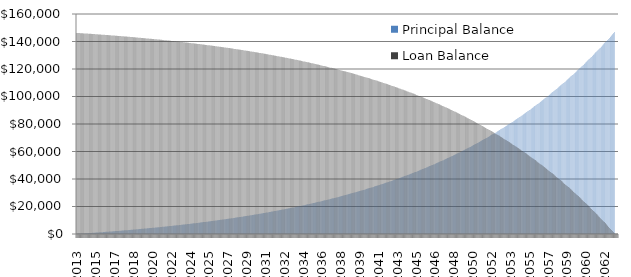
| Category | Principal Balance  | Loan Balance  |
|---|---|---|
| 2013.0 | 42.205 | 146250 |
| 2013.0 | 84.613 | 146207.795 |
| 2013.0 | 127.223 | 146165.387 |
| 2013.0 | 170.038 | 146122.777 |
| 2014.0 | 213.058 | 146079.962 |
| 2014.0 | 256.284 | 146036.942 |
| 2014.0 | 299.718 | 145993.716 |
| 2014.0 | 343.359 | 145950.282 |
| 2014.0 | 387.209 | 145906.641 |
| 2014.0 | 431.27 | 145862.791 |
| 2014.0 | 475.542 | 145818.73 |
| 2014.0 | 520.026 | 145774.458 |
| 2014.0 | 564.723 | 145729.974 |
| 2014.0 | 609.634 | 145685.277 |
| 2014.0 | 654.76 | 145640.366 |
| 2014.0 | 700.103 | 145595.24 |
| 2015.0 | 745.663 | 145549.897 |
| 2015.0 | 791.441 | 145504.337 |
| 2015.0 | 837.438 | 145458.559 |
| 2015.0 | 883.656 | 145412.562 |
| 2015.0 | 930.096 | 145366.344 |
| 2015.0 | 976.758 | 145319.904 |
| 2015.0 | 1023.643 | 145273.242 |
| 2015.0 | 1070.753 | 145226.357 |
| 2015.0 | 1118.089 | 145179.247 |
| 2015.0 | 1165.652 | 145131.911 |
| 2015.0 | 1213.443 | 145084.348 |
| 2015.0 | 1261.462 | 145036.557 |
| 2016.0 | 1309.712 | 144988.538 |
| 2016.0 | 1358.193 | 144940.288 |
| 2016.0 | 1406.906 | 144891.807 |
| 2016.0 | 1455.853 | 144843.094 |
| 2016.0 | 1505.034 | 144794.147 |
| 2016.0 | 1554.451 | 144744.966 |
| 2016.0 | 1604.104 | 144695.549 |
| 2016.0 | 1653.996 | 144645.896 |
| 2016.0 | 1704.127 | 144596.004 |
| 2016.0 | 1754.497 | 144545.873 |
| 2016.0 | 1805.11 | 144495.503 |
| 2016.0 | 1855.964 | 144444.89 |
| 2017.0 | 1907.063 | 144394.036 |
| 2017.0 | 1958.406 | 144342.937 |
| 2017.0 | 2009.995 | 144291.594 |
| 2017.0 | 2061.832 | 144240.005 |
| 2017.0 | 2113.916 | 144188.168 |
| 2017.0 | 2166.251 | 144136.084 |
| 2017.0 | 2218.836 | 144083.749 |
| 2017.0 | 2271.673 | 144031.164 |
| 2017.0 | 2324.764 | 143978.327 |
| 2017.0 | 2378.108 | 143925.236 |
| 2017.0 | 2431.709 | 143871.892 |
| 2017.0 | 2485.566 | 143818.291 |
| 2018.0 | 2539.681 | 143764.434 |
| 2018.0 | 2594.055 | 143710.319 |
| 2018.0 | 2648.691 | 143655.945 |
| 2018.0 | 2703.587 | 143601.309 |
| 2018.0 | 2758.747 | 143546.413 |
| 2018.0 | 2814.172 | 143491.253 |
| 2018.0 | 2869.861 | 143435.828 |
| 2018.0 | 2925.818 | 143380.139 |
| 2018.0 | 2982.043 | 143324.182 |
| 2018.0 | 3038.537 | 143267.957 |
| 2018.0 | 3095.302 | 143211.463 |
| 2018.0 | 3152.339 | 143154.698 |
| 2019.0 | 3209.649 | 143097.661 |
| 2019.0 | 3267.234 | 143040.351 |
| 2019.0 | 3325.094 | 142982.766 |
| 2019.0 | 3383.232 | 142924.906 |
| 2019.0 | 3441.649 | 142866.768 |
| 2019.0 | 3500.345 | 142808.351 |
| 2019.0 | 3559.323 | 142749.655 |
| 2019.0 | 3618.583 | 142690.677 |
| 2019.0 | 3678.128 | 142631.417 |
| 2019.0 | 3737.957 | 142571.872 |
| 2019.0 | 3798.073 | 142512.043 |
| 2019.0 | 3858.478 | 142451.927 |
| 2020.0 | 3919.171 | 142391.522 |
| 2020.0 | 3980.156 | 142330.829 |
| 2020.0 | 4041.433 | 142269.844 |
| 2020.0 | 4103.003 | 142208.567 |
| 2020.0 | 4164.869 | 142146.997 |
| 2020.0 | 4227.031 | 142085.131 |
| 2020.0 | 4289.49 | 142022.969 |
| 2020.0 | 4352.249 | 141960.51 |
| 2020.0 | 4415.309 | 141897.751 |
| 2020.0 | 4478.671 | 141834.691 |
| 2020.0 | 4542.337 | 141771.329 |
| 2020.0 | 4606.307 | 141707.663 |
| 2021.0 | 4670.584 | 141643.693 |
| 2021.0 | 4735.169 | 141579.416 |
| 2021.0 | 4800.064 | 141514.831 |
| 2021.0 | 4865.269 | 141449.936 |
| 2021.0 | 4930.787 | 141384.731 |
| 2021.0 | 4996.619 | 141319.213 |
| 2021.0 | 5062.767 | 141253.381 |
| 2021.0 | 5129.231 | 141187.233 |
| 2021.0 | 5196.014 | 141120.769 |
| 2021.0 | 5263.117 | 141053.986 |
| 2021.0 | 5330.541 | 140986.883 |
| 2021.0 | 5398.288 | 140919.459 |
| 2022.0 | 5466.36 | 140851.712 |
| 2022.0 | 5534.759 | 140783.64 |
| 2022.0 | 5603.484 | 140715.241 |
| 2022.0 | 5672.54 | 140646.516 |
| 2022.0 | 5741.926 | 140577.46 |
| 2022.0 | 5811.644 | 140508.074 |
| 2022.0 | 5881.697 | 140438.356 |
| 2022.0 | 5952.086 | 140368.303 |
| 2022.0 | 6022.811 | 140297.914 |
| 2022.0 | 6093.876 | 140227.189 |
| 2022.0 | 6165.281 | 140156.124 |
| 2022.0 | 6237.028 | 140084.719 |
| 2023.0 | 6309.119 | 140012.972 |
| 2023.0 | 6381.555 | 139940.881 |
| 2023.0 | 6454.339 | 139868.445 |
| 2023.0 | 6527.471 | 139795.661 |
| 2023.0 | 6600.954 | 139722.529 |
| 2023.0 | 6674.789 | 139649.046 |
| 2023.0 | 6748.977 | 139575.211 |
| 2023.0 | 6823.521 | 139501.023 |
| 2023.0 | 6898.422 | 139426.479 |
| 2023.0 | 6973.683 | 139351.578 |
| 2023.0 | 7049.303 | 139276.317 |
| 2023.0 | 7125.287 | 139200.697 |
| 2024.0 | 7201.634 | 139124.713 |
| 2024.0 | 7278.347 | 139048.366 |
| 2024.0 | 7355.427 | 138971.653 |
| 2024.0 | 7432.877 | 138894.573 |
| 2024.0 | 7510.699 | 138817.123 |
| 2024.0 | 7588.892 | 138739.301 |
| 2024.0 | 7667.461 | 138661.108 |
| 2024.0 | 7746.406 | 138582.539 |
| 2024.0 | 7825.73 | 138503.594 |
| 2024.0 | 7905.433 | 138424.27 |
| 2024.0 | 7985.519 | 138344.567 |
| 2024.0 | 8065.988 | 138264.481 |
| 2025.0 | 8146.843 | 138184.012 |
| 2025.0 | 8228.085 | 138103.157 |
| 2025.0 | 8309.716 | 138021.915 |
| 2025.0 | 8391.739 | 137940.284 |
| 2025.0 | 8474.154 | 137858.261 |
| 2025.0 | 8556.965 | 137775.846 |
| 2025.0 | 8640.172 | 137693.035 |
| 2025.0 | 8723.778 | 137609.828 |
| 2025.0 | 8807.785 | 137526.222 |
| 2025.0 | 8892.194 | 137442.215 |
| 2025.0 | 8977.008 | 137357.806 |
| 2025.0 | 9062.228 | 137272.992 |
| 2026.0 | 9147.856 | 137187.772 |
| 2026.0 | 9233.895 | 137102.144 |
| 2026.0 | 9320.346 | 137016.105 |
| 2026.0 | 9407.211 | 136929.654 |
| 2026.0 | 9494.493 | 136842.789 |
| 2026.0 | 9582.192 | 136755.507 |
| 2026.0 | 9670.312 | 136667.808 |
| 2026.0 | 9758.854 | 136579.688 |
| 2026.0 | 9847.821 | 136491.146 |
| 2026.0 | 9937.213 | 136402.179 |
| 2026.0 | 10027.034 | 136312.787 |
| 2026.0 | 10117.286 | 136222.966 |
| 2027.0 | 10207.97 | 136132.714 |
| 2027.0 | 10299.088 | 136042.03 |
| 2027.0 | 10390.643 | 135950.912 |
| 2027.0 | 10482.637 | 135859.357 |
| 2027.0 | 10575.071 | 135767.363 |
| 2027.0 | 10667.949 | 135674.929 |
| 2027.0 | 10761.271 | 135582.051 |
| 2027.0 | 10855.041 | 135488.729 |
| 2027.0 | 10949.26 | 135394.959 |
| 2027.0 | 11043.93 | 135300.74 |
| 2027.0 | 11139.054 | 135206.07 |
| 2027.0 | 11234.634 | 135110.946 |
| 2028.0 | 11330.672 | 135015.366 |
| 2028.0 | 11427.17 | 134919.328 |
| 2028.0 | 11524.131 | 134822.83 |
| 2028.0 | 11621.556 | 134725.869 |
| 2028.0 | 11719.447 | 134628.444 |
| 2028.0 | 11817.808 | 134530.553 |
| 2028.0 | 11916.641 | 134432.192 |
| 2028.0 | 12015.946 | 134333.359 |
| 2028.0 | 12115.728 | 134234.054 |
| 2028.0 | 12215.988 | 134134.272 |
| 2028.0 | 12316.728 | 134034.012 |
| 2028.0 | 12417.951 | 133933.272 |
| 2029.0 | 12519.659 | 133832.049 |
| 2029.0 | 12621.854 | 133730.341 |
| 2029.0 | 12724.539 | 133628.146 |
| 2029.0 | 12827.716 | 133525.461 |
| 2029.0 | 12931.387 | 133422.284 |
| 2029.0 | 13035.555 | 133318.613 |
| 2029.0 | 13140.223 | 133214.445 |
| 2029.0 | 13245.391 | 133109.777 |
| 2029.0 | 13351.064 | 133004.609 |
| 2029.0 | 13457.243 | 132898.936 |
| 2029.0 | 13563.931 | 132792.757 |
| 2029.0 | 13671.13 | 132686.069 |
| 2030.0 | 13778.843 | 132578.87 |
| 2030.0 | 13887.072 | 132471.157 |
| 2030.0 | 13995.819 | 132362.928 |
| 2030.0 | 14105.088 | 132254.181 |
| 2030.0 | 14214.88 | 132144.912 |
| 2030.0 | 14325.198 | 132035.12 |
| 2030.0 | 14436.045 | 131924.802 |
| 2030.0 | 14547.423 | 131813.955 |
| 2030.0 | 14659.334 | 131702.577 |
| 2030.0 | 14771.782 | 131590.666 |
| 2030.0 | 14884.769 | 131478.218 |
| 2030.0 | 14998.297 | 131365.231 |
| 2031.0 | 15112.369 | 131251.703 |
| 2031.0 | 15226.988 | 131137.631 |
| 2031.0 | 15342.155 | 131023.012 |
| 2031.0 | 15457.875 | 130907.845 |
| 2031.0 | 15574.149 | 130792.125 |
| 2031.0 | 15690.981 | 130675.851 |
| 2031.0 | 15808.372 | 130559.019 |
| 2031.0 | 15926.326 | 130441.628 |
| 2031.0 | 16044.844 | 130323.674 |
| 2031.0 | 16163.931 | 130205.156 |
| 2031.0 | 16283.589 | 130086.069 |
| 2031.0 | 16403.819 | 129966.411 |
| 2032.0 | 16524.626 | 129846.181 |
| 2032.0 | 16646.012 | 129725.374 |
| 2032.0 | 16767.979 | 129603.988 |
| 2032.0 | 16890.531 | 129482.021 |
| 2032.0 | 17013.67 | 129359.469 |
| 2032.0 | 17137.399 | 129236.33 |
| 2032.0 | 17261.721 | 129112.601 |
| 2032.0 | 17386.639 | 128988.279 |
| 2032.0 | 17512.155 | 128863.361 |
| 2032.0 | 17638.272 | 128737.845 |
| 2032.0 | 17764.994 | 128611.728 |
| 2032.0 | 17892.324 | 128485.006 |
| 2033.0 | 18020.263 | 128357.676 |
| 2033.0 | 18148.815 | 128229.737 |
| 2033.0 | 18277.983 | 128101.185 |
| 2033.0 | 18407.771 | 127972.017 |
| 2033.0 | 18538.18 | 127842.229 |
| 2033.0 | 18669.214 | 127711.82 |
| 2033.0 | 18800.876 | 127580.786 |
| 2033.0 | 18933.168 | 127449.124 |
| 2033.0 | 19066.095 | 127316.832 |
| 2033.0 | 19199.659 | 127183.905 |
| 2033.0 | 19333.862 | 127050.341 |
| 2033.0 | 19468.709 | 126916.138 |
| 2034.0 | 19604.202 | 126781.291 |
| 2034.0 | 19740.344 | 126645.798 |
| 2034.0 | 19877.138 | 126509.656 |
| 2034.0 | 20014.588 | 126372.862 |
| 2034.0 | 20152.696 | 126235.412 |
| 2034.0 | 20291.467 | 126097.304 |
| 2034.0 | 20430.902 | 125958.533 |
| 2034.0 | 20571.005 | 125819.098 |
| 2034.0 | 20711.78 | 125678.995 |
| 2034.0 | 20853.229 | 125538.22 |
| 2034.0 | 20995.356 | 125396.771 |
| 2034.0 | 21138.164 | 125254.644 |
| 2035.0 | 21281.656 | 125111.836 |
| 2035.0 | 21425.836 | 124968.344 |
| 2035.0 | 21570.706 | 124824.164 |
| 2035.0 | 21716.271 | 124679.294 |
| 2035.0 | 21862.534 | 124533.729 |
| 2035.0 | 22009.497 | 124387.466 |
| 2035.0 | 22157.164 | 124240.503 |
| 2035.0 | 22305.539 | 124092.836 |
| 2035.0 | 22454.625 | 123944.461 |
| 2035.0 | 22604.425 | 123795.375 |
| 2035.0 | 22754.944 | 123645.575 |
| 2035.0 | 22906.183 | 123495.056 |
| 2036.0 | 23058.147 | 123343.817 |
| 2036.0 | 23210.839 | 123191.853 |
| 2036.0 | 23364.263 | 123039.161 |
| 2036.0 | 23518.422 | 122885.737 |
| 2036.0 | 23673.32 | 122731.578 |
| 2036.0 | 23828.959 | 122576.68 |
| 2036.0 | 23985.345 | 122421.041 |
| 2036.0 | 24142.48 | 122264.655 |
| 2036.0 | 24300.368 | 122107.52 |
| 2036.0 | 24459.012 | 121949.632 |
| 2036.0 | 24618.417 | 121790.988 |
| 2036.0 | 24778.586 | 121631.583 |
| 2037.0 | 24939.522 | 121471.414 |
| 2037.0 | 25101.229 | 121310.478 |
| 2037.0 | 25263.711 | 121148.771 |
| 2037.0 | 25426.971 | 120986.289 |
| 2037.0 | 25591.014 | 120823.029 |
| 2037.0 | 25755.843 | 120658.986 |
| 2037.0 | 25921.461 | 120494.157 |
| 2037.0 | 26087.874 | 120328.539 |
| 2037.0 | 26255.083 | 120162.126 |
| 2037.0 | 26423.094 | 119994.917 |
| 2037.0 | 26591.91 | 119826.906 |
| 2037.0 | 26761.535 | 119658.09 |
| 2038.0 | 26931.972 | 119488.465 |
| 2038.0 | 27103.227 | 119318.028 |
| 2038.0 | 27275.301 | 119146.773 |
| 2038.0 | 27448.201 | 118974.699 |
| 2038.0 | 27621.929 | 118801.799 |
| 2038.0 | 27796.489 | 118628.071 |
| 2038.0 | 27971.886 | 118453.511 |
| 2038.0 | 28148.123 | 118278.114 |
| 2038.0 | 28325.204 | 118101.877 |
| 2038.0 | 28503.135 | 117924.796 |
| 2038.0 | 28681.917 | 117746.865 |
| 2038.0 | 28861.557 | 117568.083 |
| 2039.0 | 29042.057 | 117388.443 |
| 2039.0 | 29223.422 | 117207.943 |
| 2039.0 | 29405.656 | 117026.578 |
| 2039.0 | 29588.763 | 116844.344 |
| 2039.0 | 29772.748 | 116661.237 |
| 2039.0 | 29957.614 | 116477.252 |
| 2039.0 | 30143.367 | 116292.386 |
| 2039.0 | 30330.009 | 116106.633 |
| 2039.0 | 30517.545 | 115919.991 |
| 2039.0 | 30705.98 | 115732.455 |
| 2039.0 | 30895.318 | 115544.02 |
| 2039.0 | 31085.564 | 115354.682 |
| 2040.0 | 31276.721 | 115164.436 |
| 2040.0 | 31468.793 | 114973.279 |
| 2040.0 | 31661.787 | 114781.207 |
| 2040.0 | 31855.705 | 114588.213 |
| 2040.0 | 32050.552 | 114394.295 |
| 2040.0 | 32246.333 | 114199.448 |
| 2040.0 | 32443.051 | 114003.667 |
| 2040.0 | 32640.713 | 113806.949 |
| 2040.0 | 32839.322 | 113609.287 |
| 2040.0 | 33038.882 | 113410.678 |
| 2040.0 | 33239.398 | 113211.118 |
| 2040.0 | 33440.876 | 113010.602 |
| 2041.0 | 33643.318 | 112809.124 |
| 2041.0 | 33846.731 | 112606.682 |
| 2041.0 | 34051.119 | 112403.269 |
| 2041.0 | 34256.486 | 112198.881 |
| 2041.0 | 34462.836 | 111993.514 |
| 2041.0 | 34670.176 | 111787.164 |
| 2041.0 | 34878.509 | 111579.824 |
| 2041.0 | 35087.841 | 111371.491 |
| 2041.0 | 35298.175 | 111162.159 |
| 2041.0 | 35509.517 | 110951.825 |
| 2041.0 | 35721.872 | 110740.483 |
| 2041.0 | 35935.245 | 110528.128 |
| 2042.0 | 36149.64 | 110314.755 |
| 2042.0 | 36365.062 | 110100.36 |
| 2042.0 | 36581.517 | 109884.938 |
| 2042.0 | 36799.008 | 109668.483 |
| 2042.0 | 37017.542 | 109450.992 |
| 2042.0 | 37237.123 | 109232.458 |
| 2042.0 | 37457.756 | 109012.877 |
| 2042.0 | 37679.446 | 108792.244 |
| 2042.0 | 37902.199 | 108570.554 |
| 2042.0 | 38126.019 | 108347.801 |
| 2042.0 | 38350.911 | 108123.981 |
| 2042.0 | 38576.881 | 107899.089 |
| 2043.0 | 38803.934 | 107673.119 |
| 2043.0 | 39032.075 | 107446.066 |
| 2043.0 | 39261.309 | 107217.925 |
| 2043.0 | 39491.641 | 106988.691 |
| 2043.0 | 39723.077 | 106758.359 |
| 2043.0 | 39955.622 | 106526.923 |
| 2043.0 | 40189.281 | 106294.378 |
| 2043.0 | 40424.06 | 106060.719 |
| 2043.0 | 40659.964 | 105825.94 |
| 2043.0 | 40896.998 | 105590.036 |
| 2043.0 | 41135.168 | 105353.002 |
| 2043.0 | 41374.479 | 105114.832 |
| 2044.0 | 41614.937 | 104875.521 |
| 2044.0 | 41856.547 | 104635.063 |
| 2044.0 | 42099.315 | 104393.453 |
| 2044.0 | 42343.246 | 104150.685 |
| 2044.0 | 42588.346 | 103906.754 |
| 2044.0 | 42834.621 | 103661.654 |
| 2044.0 | 43082.075 | 103415.379 |
| 2044.0 | 43330.715 | 103167.925 |
| 2044.0 | 43580.547 | 102919.285 |
| 2044.0 | 43831.576 | 102669.453 |
| 2044.0 | 44083.807 | 102418.424 |
| 2044.0 | 44337.247 | 102166.193 |
| 2045.0 | 44591.902 | 101912.753 |
| 2045.0 | 44847.777 | 101658.098 |
| 2045.0 | 45104.877 | 101402.223 |
| 2045.0 | 45363.21 | 101145.123 |
| 2045.0 | 45622.781 | 100886.79 |
| 2045.0 | 45883.595 | 100627.219 |
| 2045.0 | 46145.659 | 100366.405 |
| 2045.0 | 46408.979 | 100104.341 |
| 2045.0 | 46673.561 | 99841.021 |
| 2045.0 | 46939.41 | 99576.439 |
| 2045.0 | 47206.533 | 99310.59 |
| 2045.0 | 47474.936 | 99043.467 |
| 2046.0 | 47744.626 | 98775.064 |
| 2046.0 | 48015.607 | 98505.374 |
| 2046.0 | 48287.887 | 98234.393 |
| 2046.0 | 48561.472 | 97962.113 |
| 2046.0 | 48836.368 | 97688.528 |
| 2046.0 | 49112.58 | 97413.632 |
| 2046.0 | 49390.117 | 97137.42 |
| 2046.0 | 49668.983 | 96859.883 |
| 2046.0 | 49949.185 | 96581.017 |
| 2046.0 | 50230.73 | 96300.815 |
| 2046.0 | 50513.625 | 96019.27 |
| 2046.0 | 50797.874 | 95736.375 |
| 2047.0 | 51083.486 | 95452.126 |
| 2047.0 | 51370.466 | 95166.514 |
| 2047.0 | 51658.822 | 94879.534 |
| 2047.0 | 51948.559 | 94591.178 |
| 2047.0 | 52239.684 | 94301.441 |
| 2047.0 | 52532.204 | 94010.316 |
| 2047.0 | 52826.126 | 93717.796 |
| 2047.0 | 53121.457 | 93423.874 |
| 2047.0 | 53418.202 | 93128.543 |
| 2047.0 | 53716.37 | 92831.798 |
| 2047.0 | 54015.966 | 92533.63 |
| 2047.0 | 54316.998 | 92234.034 |
| 2048.0 | 54619.472 | 91933.002 |
| 2048.0 | 54923.395 | 91630.528 |
| 2048.0 | 55228.775 | 91326.605 |
| 2048.0 | 55535.618 | 91021.225 |
| 2048.0 | 55843.932 | 90714.382 |
| 2048.0 | 56153.722 | 90406.068 |
| 2048.0 | 56464.998 | 90096.278 |
| 2048.0 | 56777.764 | 89785.002 |
| 2048.0 | 57092.03 | 89472.236 |
| 2048.0 | 57407.801 | 89157.97 |
| 2048.0 | 57725.085 | 88842.199 |
| 2048.0 | 58043.89 | 88524.915 |
| 2049.0 | 58364.222 | 88206.11 |
| 2049.0 | 58686.089 | 87885.778 |
| 2049.0 | 59009.498 | 87563.911 |
| 2049.0 | 59334.457 | 87240.502 |
| 2049.0 | 59660.974 | 86915.543 |
| 2049.0 | 59989.054 | 86589.026 |
| 2049.0 | 60318.707 | 86260.946 |
| 2049.0 | 60649.939 | 85931.293 |
| 2049.0 | 60982.759 | 85600.061 |
| 2049.0 | 61317.173 | 85267.241 |
| 2049.0 | 61653.19 | 84932.827 |
| 2049.0 | 61990.817 | 84596.81 |
| 2050.0 | 62330.061 | 84259.183 |
| 2050.0 | 62670.931 | 83919.939 |
| 2050.0 | 63013.435 | 83579.069 |
| 2050.0 | 63357.579 | 83236.565 |
| 2050.0 | 63703.373 | 82892.421 |
| 2050.0 | 64050.823 | 82546.627 |
| 2050.0 | 64399.939 | 82199.177 |
| 2050.0 | 64750.727 | 81850.061 |
| 2050.0 | 65103.196 | 81499.273 |
| 2050.0 | 65457.354 | 81146.804 |
| 2050.0 | 65813.209 | 80792.646 |
| 2050.0 | 66170.77 | 80436.791 |
| 2051.0 | 66530.043 | 80079.23 |
| 2051.0 | 66891.038 | 79719.957 |
| 2051.0 | 67253.763 | 79358.962 |
| 2051.0 | 67618.226 | 78996.237 |
| 2051.0 | 67984.435 | 78631.774 |
| 2051.0 | 68352.399 | 78265.565 |
| 2051.0 | 68722.126 | 77897.601 |
| 2051.0 | 69093.625 | 77527.874 |
| 2051.0 | 69466.904 | 77156.375 |
| 2051.0 | 69841.971 | 76783.096 |
| 2051.0 | 70218.836 | 76408.029 |
| 2051.0 | 70597.506 | 76031.164 |
| 2052.0 | 70977.991 | 75652.494 |
| 2052.0 | 71360.299 | 75272.009 |
| 2052.0 | 71744.439 | 74889.701 |
| 2052.0 | 72130.42 | 74505.561 |
| 2052.0 | 72518.25 | 74119.58 |
| 2052.0 | 72907.938 | 73731.75 |
| 2052.0 | 73299.494 | 73342.062 |
| 2052.0 | 73692.926 | 72950.506 |
| 2052.0 | 74088.243 | 72557.074 |
| 2052.0 | 74485.455 | 72161.757 |
| 2052.0 | 74884.569 | 71764.545 |
| 2052.0 | 75285.597 | 71365.431 |
| 2053.0 | 75688.545 | 70964.403 |
| 2053.0 | 76093.425 | 70561.455 |
| 2053.0 | 76500.244 | 70156.575 |
| 2053.0 | 76909.013 | 69749.756 |
| 2053.0 | 77319.741 | 69340.987 |
| 2053.0 | 77732.436 | 68930.259 |
| 2053.0 | 78147.11 | 68517.564 |
| 2053.0 | 78563.77 | 68102.89 |
| 2053.0 | 78982.426 | 67686.23 |
| 2053.0 | 79403.089 | 67267.574 |
| 2053.0 | 79825.767 | 66846.911 |
| 2053.0 | 80250.471 | 66424.233 |
| 2054.0 | 80677.21 | 65999.529 |
| 2054.0 | 81105.993 | 65572.79 |
| 2054.0 | 81536.831 | 65144.007 |
| 2054.0 | 81969.734 | 64713.169 |
| 2054.0 | 82404.711 | 64280.266 |
| 2054.0 | 82841.772 | 63845.289 |
| 2054.0 | 83280.927 | 63408.228 |
| 2054.0 | 83722.187 | 62969.073 |
| 2054.0 | 84165.561 | 62527.813 |
| 2054.0 | 84611.06 | 62084.439 |
| 2054.0 | 85058.693 | 61638.94 |
| 2054.0 | 85508.471 | 61191.307 |
| 2055.0 | 85960.404 | 60741.529 |
| 2055.0 | 86414.503 | 60289.596 |
| 2055.0 | 86870.778 | 59835.497 |
| 2055.0 | 87329.239 | 59379.222 |
| 2055.0 | 87789.897 | 58920.761 |
| 2055.0 | 88252.762 | 58460.103 |
| 2055.0 | 88717.845 | 57997.238 |
| 2055.0 | 89185.156 | 57532.155 |
| 2055.0 | 89654.707 | 57064.844 |
| 2055.0 | 90126.508 | 56595.293 |
| 2055.0 | 90600.569 | 56123.492 |
| 2055.0 | 91076.902 | 55649.431 |
| 2056.0 | 91555.517 | 55173.098 |
| 2056.0 | 92036.426 | 54694.483 |
| 2056.0 | 92519.639 | 54213.574 |
| 2056.0 | 93005.168 | 53730.361 |
| 2056.0 | 93493.023 | 53244.832 |
| 2056.0 | 93983.215 | 52756.977 |
| 2056.0 | 94475.757 | 52266.785 |
| 2056.0 | 94970.658 | 51774.243 |
| 2056.0 | 95467.931 | 51279.342 |
| 2056.0 | 95967.587 | 50782.069 |
| 2056.0 | 96469.637 | 50282.413 |
| 2056.0 | 96974.093 | 49780.363 |
| 2057.0 | 97480.965 | 49275.907 |
| 2057.0 | 97990.267 | 48769.035 |
| 2057.0 | 98502.009 | 48259.733 |
| 2057.0 | 99016.203 | 47747.991 |
| 2057.0 | 99532.861 | 47233.797 |
| 2057.0 | 100051.994 | 46717.139 |
| 2057.0 | 100573.615 | 46198.006 |
| 2057.0 | 101097.736 | 45676.385 |
| 2057.0 | 101624.368 | 45152.264 |
| 2057.0 | 102153.523 | 44625.632 |
| 2057.0 | 102685.214 | 44096.477 |
| 2057.0 | 103219.452 | 43564.786 |
| 2058.0 | 103756.251 | 43030.548 |
| 2058.0 | 104295.621 | 42493.749 |
| 2058.0 | 104837.576 | 41954.379 |
| 2058.0 | 105382.128 | 41412.424 |
| 2058.0 | 105929.29 | 40867.872 |
| 2058.0 | 106479.073 | 40320.71 |
| 2058.0 | 107031.49 | 39770.927 |
| 2058.0 | 107586.554 | 39218.51 |
| 2058.0 | 108144.279 | 38663.446 |
| 2058.0 | 108704.675 | 38105.721 |
| 2058.0 | 109267.757 | 37545.325 |
| 2058.0 | 109833.537 | 36982.243 |
| 2059.0 | 110402.028 | 36416.463 |
| 2059.0 | 110973.243 | 35847.972 |
| 2059.0 | 111547.195 | 35276.757 |
| 2059.0 | 112123.897 | 34702.805 |
| 2059.0 | 112703.362 | 34126.103 |
| 2059.0 | 113285.605 | 33546.638 |
| 2059.0 | 113870.637 | 32964.395 |
| 2059.0 | 114458.472 | 32379.363 |
| 2059.0 | 115049.124 | 31791.528 |
| 2059.0 | 115642.606 | 31200.876 |
| 2059.0 | 116238.932 | 30607.394 |
| 2059.0 | 116838.116 | 30011.068 |
| 2060.0 | 117440.17 | 29411.884 |
| 2060.0 | 118045.11 | 28809.83 |
| 2060.0 | 118652.948 | 28204.89 |
| 2060.0 | 119263.698 | 27597.052 |
| 2060.0 | 119877.376 | 26986.302 |
| 2060.0 | 120493.993 | 26372.624 |
| 2060.0 | 121113.565 | 25756.007 |
| 2060.0 | 121736.106 | 25136.435 |
| 2060.0 | 122361.631 | 24513.894 |
| 2060.0 | 122990.152 | 23888.369 |
| 2060.0 | 123621.685 | 23259.848 |
| 2060.0 | 124256.244 | 22628.315 |
| 2061.0 | 124893.844 | 21993.756 |
| 2061.0 | 125534.499 | 21356.156 |
| 2061.0 | 126178.223 | 20715.501 |
| 2061.0 | 126825.033 | 20071.777 |
| 2061.0 | 127474.941 | 19424.967 |
| 2061.0 | 128127.964 | 18775.059 |
| 2061.0 | 128784.115 | 18122.036 |
| 2061.0 | 129443.411 | 17465.885 |
| 2061.0 | 130105.866 | 16806.589 |
| 2061.0 | 130771.495 | 16144.134 |
| 2061.0 | 131440.314 | 15478.505 |
| 2061.0 | 132112.337 | 14809.686 |
| 2062.0 | 132787.581 | 14137.663 |
| 2062.0 | 133466.06 | 13462.419 |
| 2062.0 | 134147.79 | 12783.94 |
| 2062.0 | 134832.787 | 12102.21 |
| 2062.0 | 135521.066 | 11417.213 |
| 2062.0 | 136212.643 | 10728.934 |
| 2062.0 | 136907.533 | 10037.357 |
| 2062.0 | 137605.754 | 9342.467 |
| 2062.0 | 138307.32 | 8644.246 |
| 2062.0 | 139012.248 | 7942.68 |
| 2062.0 | 139720.553 | 7237.752 |
| 2062.0 | 140432.253 | 6529.447 |
| 2063.0 | 141147.363 | 5817.747 |
| 2063.0 | 141865.899 | 5102.637 |
| 2063.0 | 142587.878 | 4384.101 |
| 2063.0 | 143313.317 | 3662.122 |
| 2063.0 | 144042.232 | 2936.683 |
| 2063.0 | 144774.64 | 2207.768 |
| 2063.0 | 145510.557 | 1475.36 |
| 2063.0 | 146250 | 739.443 |
| 2063.0 | 146989.443 | 0 |
| 2063.0 | 0 | 0 |
| 2063.0 | 0 | 0 |
| 2063.0 | 0 | 0 |